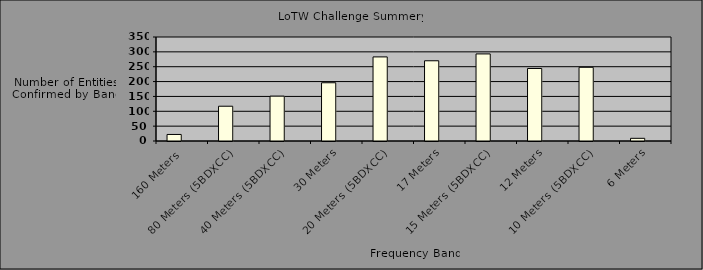
| Category | Series 0 | Series 1 |
|---|---|---|
| 160 Meters | 22 |  |
| 80 Meters (5BDXCC) | 117 |  |
| 40 Meters (5BDXCC) | 151 |  |
| 30 Meters | 196 |  |
| 20 Meters (5BDXCC) | 283 |  |
| 17 Meters | 270 |  |
| 15 Meters (5BDXCC) | 293 |  |
| 12 Meters | 244 |  |
| 10 Meters (5BDXCC) | 248 |  |
| 6 Meters | 9 |  |